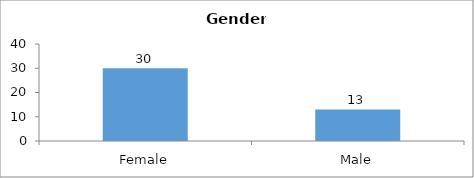
| Category | Gender |
|---|---|
| Female | 30 |
| Male | 13 |